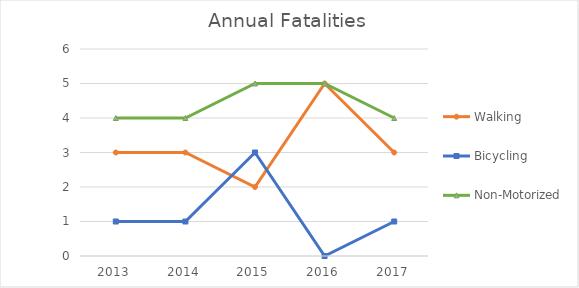
| Category | Walking | Bicycling | Non-Motorized |
|---|---|---|---|
| 2013 | 3 | 1 | 4 |
| 2014 | 3 | 1 | 4 |
| 2015 | 2 | 3 | 5 |
| 2016 | 5 | 0 | 5 |
| 2017 | 3 | 1 | 4 |